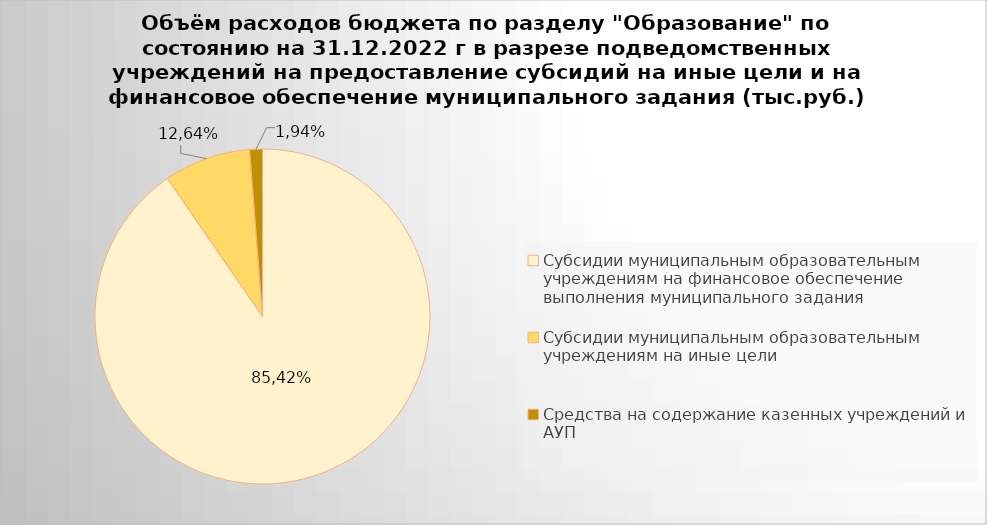
| Category | Series 0 |
|---|---|
| Субсидии муниципальным образовательным учреждениям на финансовое обеспечение выполнения муниципального задания | 7483993.13 |
| Субсидии муниципальным образовательным учреждениям на иные цели | 692551.95 |
| Средства на содержание казенных учреждений и АУП | 102255.65 |